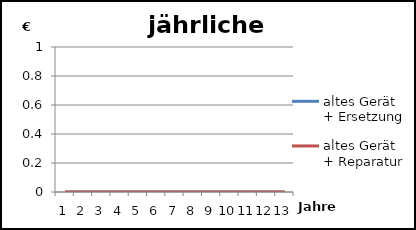
| Category | altes Gerät + Ersetzung | altes Gerät + Reparatur |
|---|---|---|
| 0 | 0 | 0 |
| 1 | 0 | 0 |
| 2 | 0 | 0 |
| 3 | 0 | 0 |
| 4 | 0 | 0 |
| 5 | 0 | 0 |
| 6 | 0 | 0 |
| 7 | 0 | 0 |
| 8 | 0 | 0 |
| 9 | 0 | 0 |
| 10 | 0 | 0 |
| 11 | 0 | 0 |
| 12 | 0 | 0 |